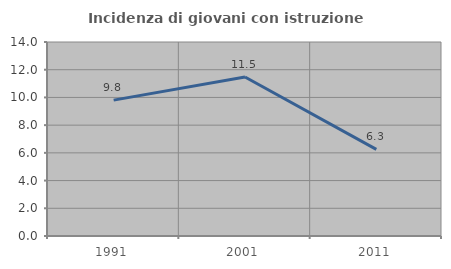
| Category | Incidenza di giovani con istruzione universitaria |
|---|---|
| 1991.0 | 9.804 |
| 2001.0 | 11.475 |
| 2011.0 | 6.25 |